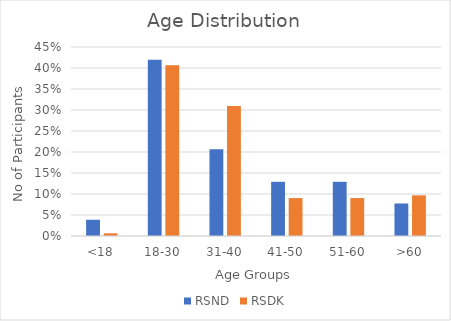
| Category | RSND | RSDK |
|---|---|---|
| <18 | 0.039 | 0.006 |
| 18-30 | 0.419 | 0.406 |
| 31-40 | 0.206 | 0.31 |
| 41-50 | 0.129 | 0.09 |
| 51-60 | 0.129 | 0.09 |
| >60 | 0.077 | 0.097 |